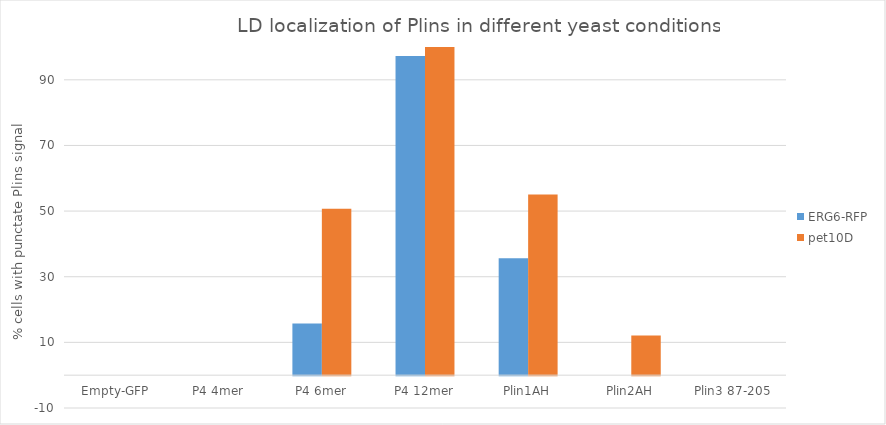
| Category | ERG6-RFP | pet10D |
|---|---|---|
| Empty-GFP | 0 | 0 |
| P4 4mer | 0 | 0 |
| P4 6mer | 15.714 | 50.704 |
| P4 12mer | 97.26 | 100 |
| Plin1AH | 35.593 | 55.085 |
| Plin2AH | 0 | 12.088 |
| Plin3 87-205 | 0 | 0 |